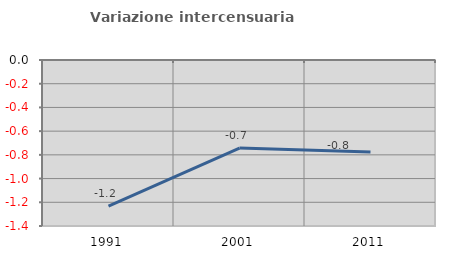
| Category | Variazione intercensuaria annua |
|---|---|
| 1991.0 | -1.232 |
| 2001.0 | -0.742 |
| 2011.0 | -0.776 |